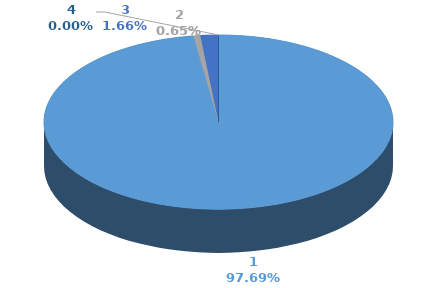
| Category | Series 0 | Series 1 |
|---|---|---|
| 0 | 1469300 |  |
| 1 | 9736 |  |
| 2 | 25000 |  |
| 3 | 0 |  |